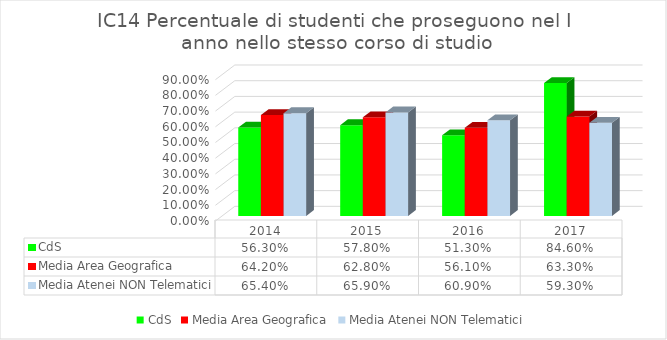
| Category | CdS | Media Area Geografica | Media Atenei NON Telematici |
|---|---|---|---|
| 2014.0 | 0.563 | 0.642 | 0.654 |
| 2015.0 | 0.578 | 0.628 | 0.659 |
| 2016.0 | 0.513 | 0.561 | 0.609 |
| 2017.0 | 0.846 | 0.633 | 0.593 |